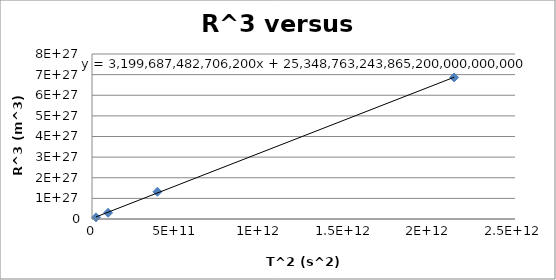
| Category | Series 0 |
|---|---|
| 23654371100.0 | 79745759599999995548270592 |
| 95036795160.0 | 301415408600000003573809152 |
| 386590193100.0 | 1320692836999999973249515520 |
| 2140148970000.0 | 6864091359000000332052824064 |